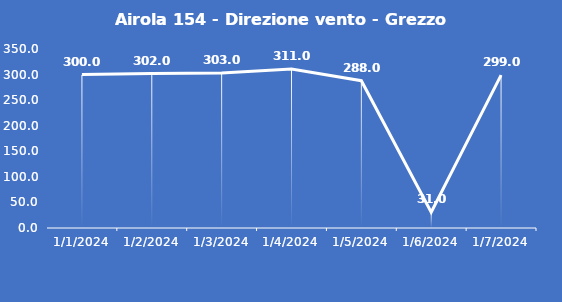
| Category | Airola 154 - Direzione vento - Grezzo (°N) |
|---|---|
| 1/1/24 | 300 |
| 1/2/24 | 302 |
| 1/3/24 | 303 |
| 1/4/24 | 311 |
| 1/5/24 | 288 |
| 1/6/24 | 31 |
| 1/7/24 | 299 |